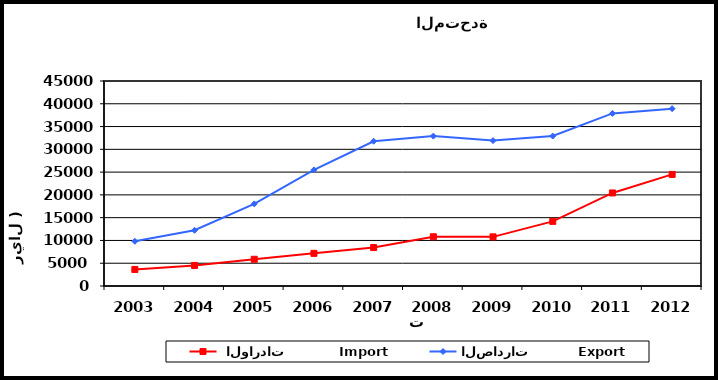
| Category |  الواردات           Import | الصادرات          Export |
|---|---|---|
| 2003.0 | 3637 | 9812 |
| 2004.0 | 4520 | 12230 |
| 2005.0 | 5862 | 18027 |
| 2006.0 | 7167 | 25488 |
| 2007.0 | 8437 | 31780 |
| 2008.0 | 10814 | 32900 |
| 2009.0 | 10790 | 31921 |
| 2010.0 | 14190 | 32923 |
| 2011.0 | 20426 | 37881 |
| 2012.0 | 24495 | 38927 |